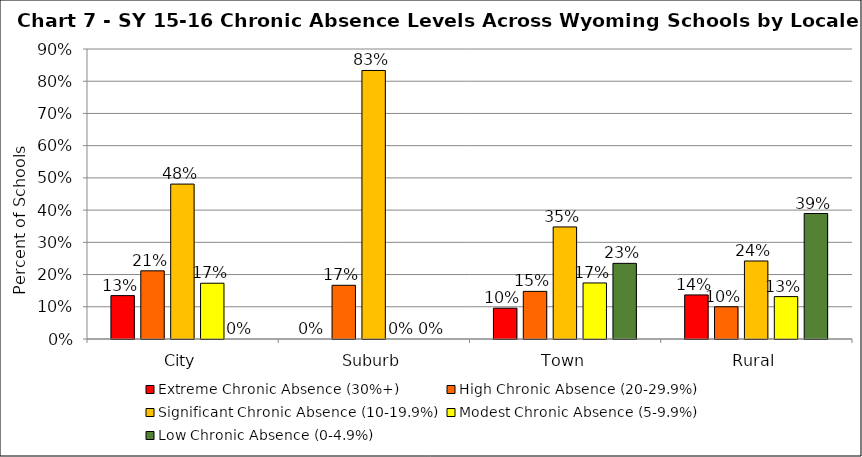
| Category | Extreme Chronic Absence (30%+) | High Chronic Absence (20-29.9%) | Significant Chronic Absence (10-19.9%) | Modest Chronic Absence (5-9.9%) | Low Chronic Absence (0-4.9%) |
|---|---|---|---|---|---|
| 0 | 0.135 | 0.212 | 0.481 | 0.173 | 0 |
| 1 | 0 | 0.167 | 0.833 | 0 | 0 |
| 2 | 0.096 | 0.148 | 0.348 | 0.174 | 0.235 |
| 3 | 0.137 | 0.1 | 0.242 | 0.132 | 0.389 |